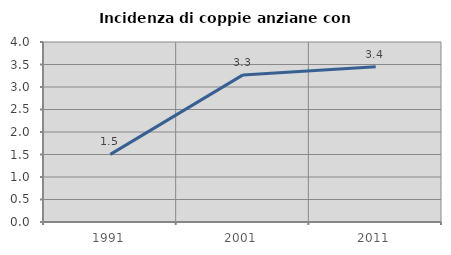
| Category | Incidenza di coppie anziane con figli |
|---|---|
| 1991.0 | 1.502 |
| 2001.0 | 3.269 |
| 2011.0 | 3.448 |